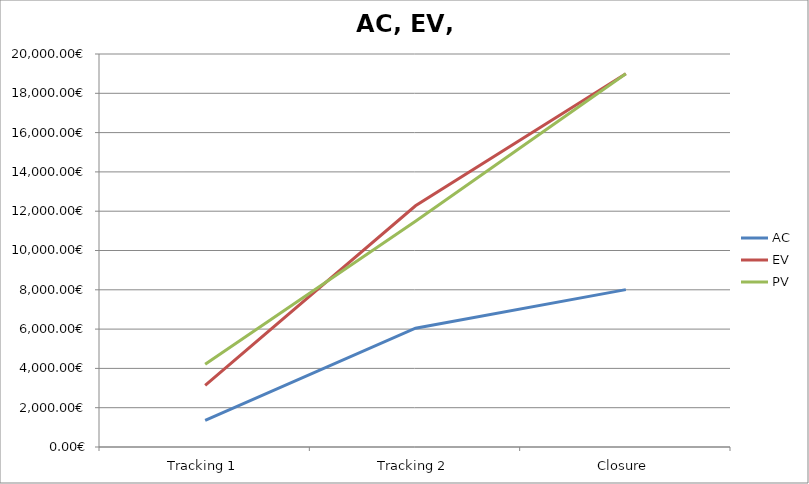
| Category | AC | EV | PV |
|---|---|---|---|
| Tracking 1 | 1350 | 3132.3 | 4215 |
| Tracking 2 | 6045 | 12275.526 | 11490 |
| Closure | 8010 | 18990 | 18990 |